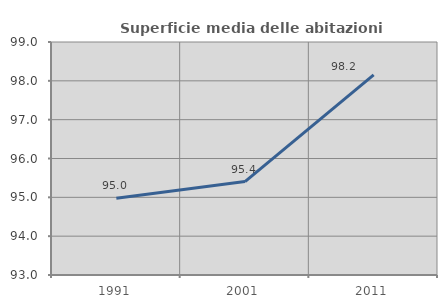
| Category | Superficie media delle abitazioni occupate |
|---|---|
| 1991.0 | 94.974 |
| 2001.0 | 95.405 |
| 2011.0 | 98.155 |